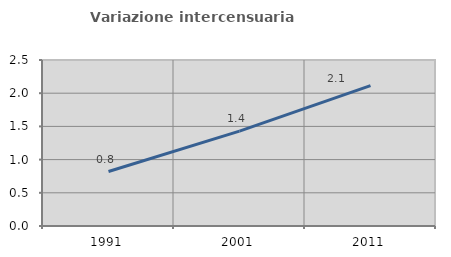
| Category | Variazione intercensuaria annua |
|---|---|
| 1991.0 | 0.82 |
| 2001.0 | 1.429 |
| 2011.0 | 2.115 |